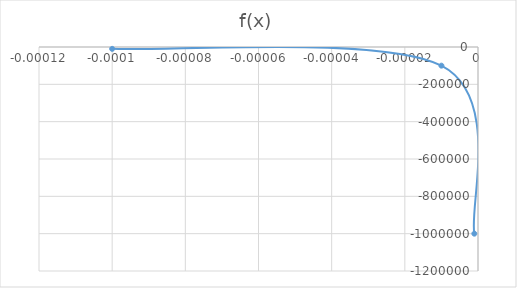
| Category | f(x) |
|---|---|
| -0.0001 | -10000 |
| -1e-05 | -100000 |
| -1e-06 | -1000000 |